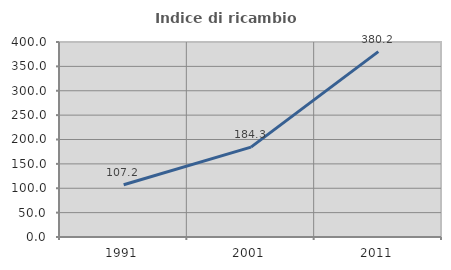
| Category | Indice di ricambio occupazionale  |
|---|---|
| 1991.0 | 107.21 |
| 2001.0 | 184.332 |
| 2011.0 | 380.247 |